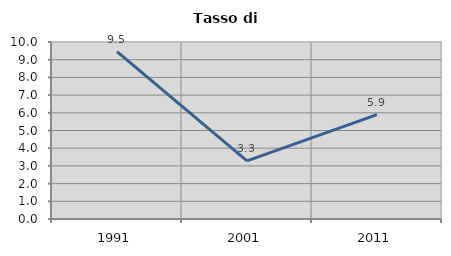
| Category | Tasso di disoccupazione   |
|---|---|
| 1991.0 | 9.451 |
| 2001.0 | 3.285 |
| 2011.0 | 5.897 |